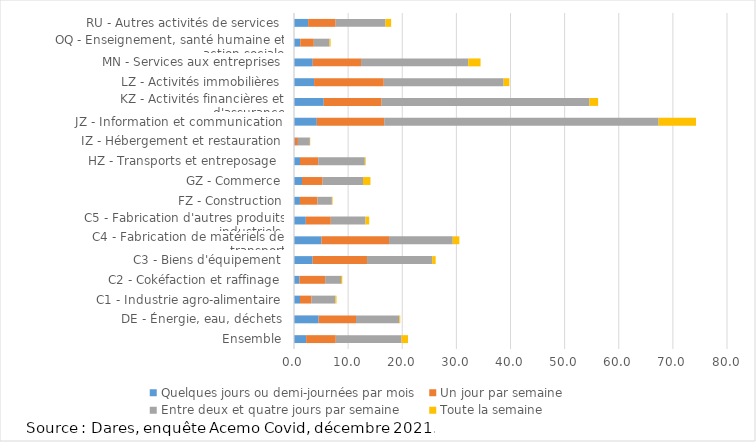
| Category | Quelques jours ou demi-journées par mois | Un jour par semaine | Entre deux et quatre jours par semaine | Toute la semaine |
|---|---|---|---|---|
| Ensemble | 2.242 | 5.476 | 12.148 | 1.195 |
| DE - Énergie, eau, déchets | 4.554 | 6.904 | 7.999 | 0.175 |
| C1 - Industrie agro-alimentaire | 1.11 | 2.124 | 4.41 | 0.212 |
| C2 - Cokéfaction et raffinage | 1.019 | 4.734 | 2.933 | 0.234 |
| C3 - Biens d'équipement | 3.453 | 10.041 | 12.031 | 0.646 |
| C4 - Fabrication de matériels de transport | 5.069 | 12.491 | 11.767 | 1.222 |
| C5 - Fabrication d'autres produits industriels  | 2.182 | 4.613 | 6.411 | 0.691 |
| FZ - Construction | 1.101 | 3.247 | 2.655 | 0.123 |
| GZ - Commerce | 1.482 | 3.809 | 7.462 | 1.373 |
| HZ - Transports et entreposage  | 1.106 | 3.368 | 8.612 | 0.153 |
| IZ - Hébergement et restauration | 0.169 | 0.556 | 2.206 | 0.068 |
| JZ - Information et communication | 4.217 | 12.451 | 50.698 | 6.912 |
| KZ - Activités financières et d'assurance | 5.496 | 10.692 | 38.389 | 1.607 |
| LZ - Activités immobilières | 3.709 | 12.877 | 22.145 | 1.057 |
| MN - Services aux entreprises | 3.464 | 8.923 | 19.809 | 2.271 |
| OQ - Enseignement, santé humaine et action sociale | 1.157 | 2.506 | 2.898 | 0.206 |
| RU - Autres activités de services | 2.611 | 5.084 | 9.218 | 1.036 |